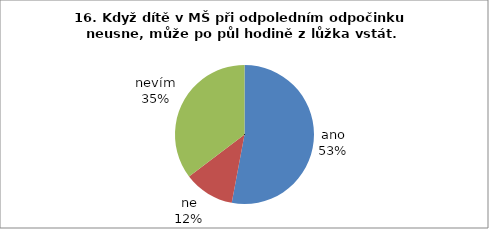
| Category | 16. |
|---|---|
| ano | 18 |
| ne | 4 |
| nevím | 12 |